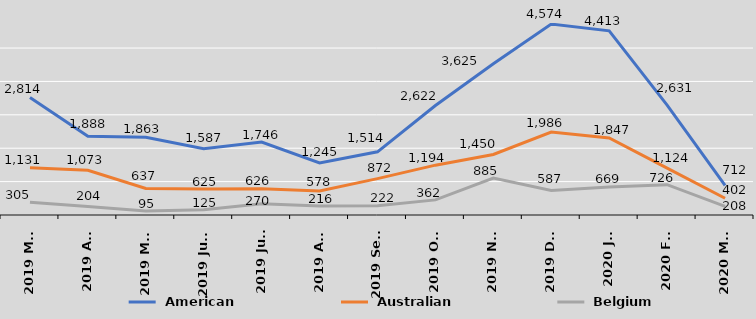
| Category |  American |  Australian |  Belgium |
|---|---|---|---|
| 2019 Mar | 2814 | 1131 | 305 |
| 2019 Apr | 1888 | 1073 | 204 |
| 2019 May | 1863 | 637 | 95 |
| 2019 June | 1587 | 625 | 125 |
| 2019 July | 1746 | 626 | 270 |
| 2019 Aug | 1245 | 578 | 216 |
| 2019 Sept | 1514 | 872 | 222 |
| 2019 Oct | 2622 | 1194 | 362 |
| 2019 Nov | 3625 | 1450 | 885 |
| 2019 Dec | 4574 | 1986 | 587 |
| 2020 Jan | 4413 | 1847 | 669 |
| 2020 Feb | 2631 | 1124 | 726 |
| 2020 Mar | 712 | 402 | 208 |